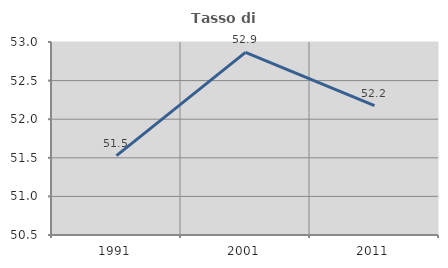
| Category | Tasso di occupazione   |
|---|---|
| 1991.0 | 51.529 |
| 2001.0 | 52.867 |
| 2011.0 | 52.176 |